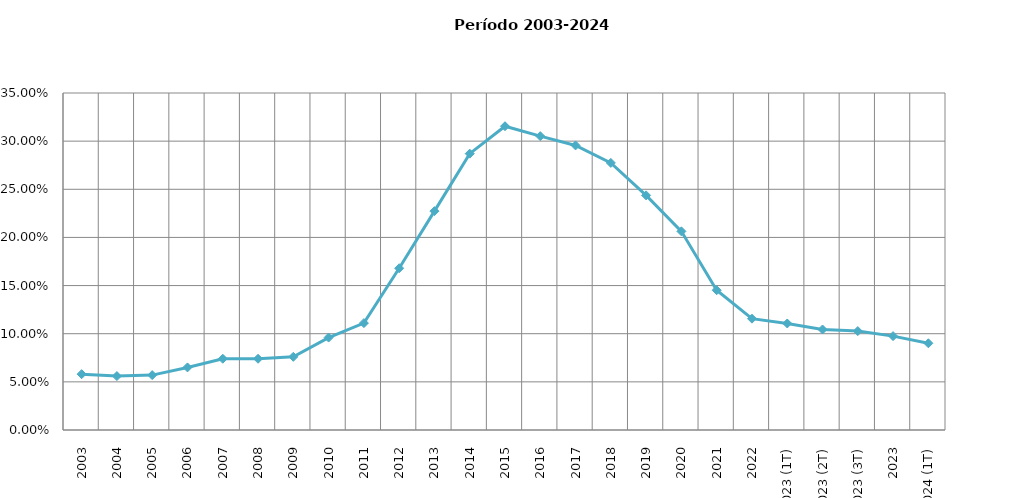
| Category | Grado estimado de penetración del servicio |
|---|---|
| 2003 | 0.058 |
| 2004 | 0.056 |
| 2005 | 0.057 |
| 2006 | 0.065 |
| 2007 | 0.074 |
| 2008 | 0.074 |
| 2009 | 0.076 |
| 2010 | 0.096 |
| 2011 | 0.111 |
| 2012 | 0.168 |
| 2013 | 0.227 |
| 2014 | 0.287 |
| 2015 | 0.315 |
| 2016 | 0.305 |
| 2017 | 0.296 |
| 2018 | 0.277 |
| 2019 | 0.244 |
| 2020 | 0.206 |
| 2021 | 0.145 |
| 2022 | 0.116 |
| 2023 (1T) | 0.111 |
| 2023 (2T) | 0.104 |
| 2023 (3T) | 0.103 |
| 2023 | 0.097 |
| 2024 (1T) | 0.09 |